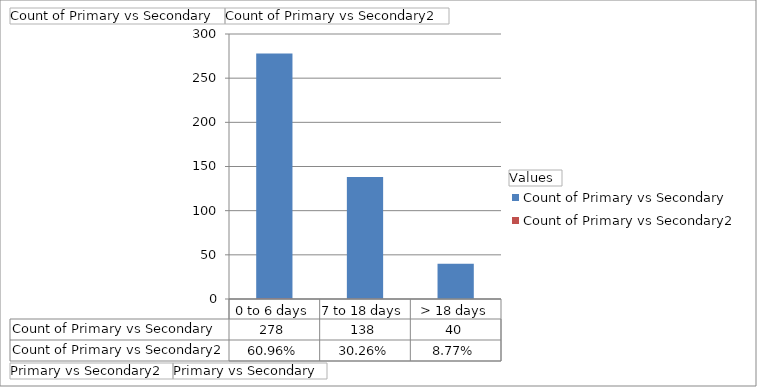
| Category | Count of Primary vs Secondary | Count of Primary vs Secondary2 |
|---|---|---|
| 0 to 6 days | 278 | 0.61 |
| 7 to 18 days | 138 | 0.303 |
| > 18 days | 40 | 0.088 |